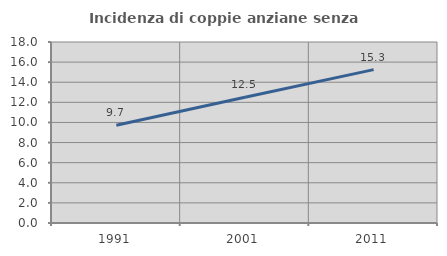
| Category | Incidenza di coppie anziane senza figli  |
|---|---|
| 1991.0 | 9.73 |
| 2001.0 | 12.5 |
| 2011.0 | 15.251 |